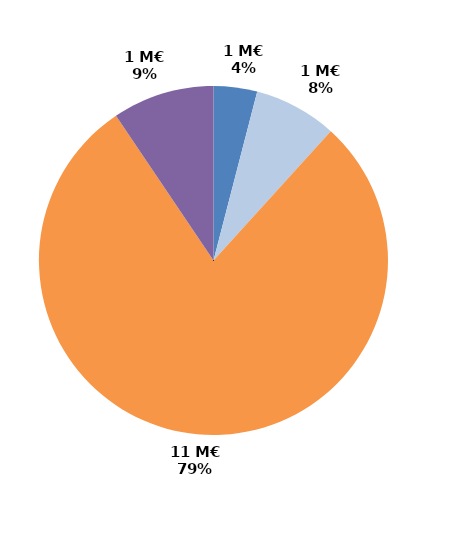
| Category | Series 0 |
|---|---|
| CIF - CPF | 0.556 |
| Période de professionnalisation | 1.06 |
| Plan de formation | 10.856 |
| Autres | 1.3 |